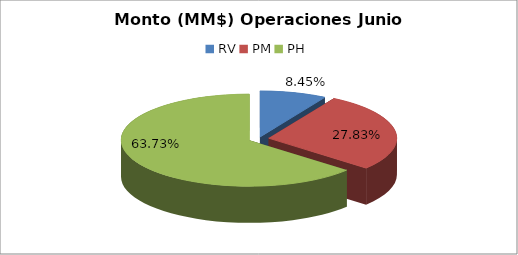
| Category | Series 0 |
|---|---|
| RV | 1074038.901 |
| PM | 3538491.307 |
| PH | 8103978.154 |